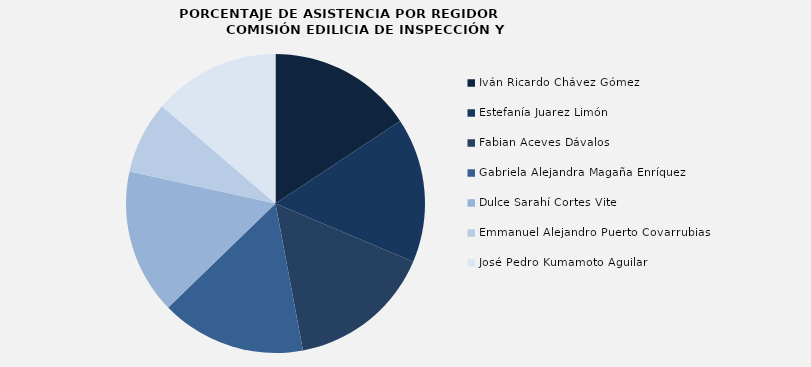
| Category | Iván Ricardo Chávez Gómez  |
|---|---|
| Iván Ricardo Chávez Gómez  | 100 |
| Estefanía Juarez Limón | 100 |
| Fabian Aceves Dávalos | 100 |
| Gabriela Alejandra Magaña Enríquez | 100 |
| Dulce Sarahí Cortes Vite | 100 |
| Emmanuel Alejandro Puerto Covarrubias | 50 |
| José Pedro Kumamoto Aguilar | 87.5 |